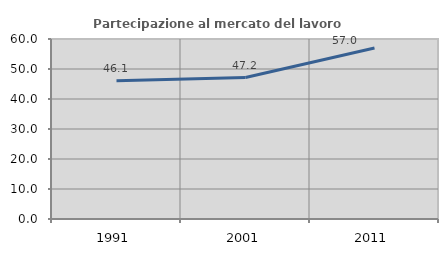
| Category | Partecipazione al mercato del lavoro  femminile |
|---|---|
| 1991.0 | 46.098 |
| 2001.0 | 47.157 |
| 2011.0 | 57.021 |